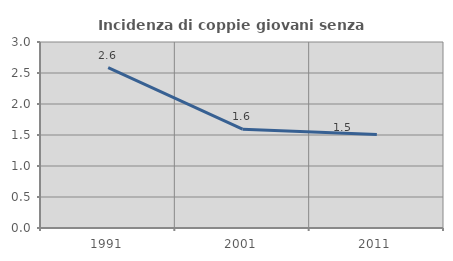
| Category | Incidenza di coppie giovani senza figli |
|---|---|
| 1991.0 | 2.586 |
| 2001.0 | 1.594 |
| 2011.0 | 1.508 |